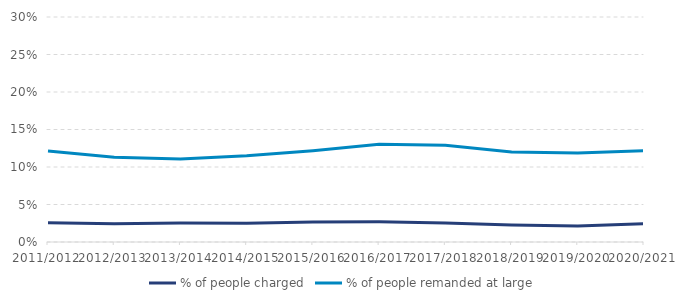
| Category | % of people charged | % of people remanded at large |
|---|---|---|
| 2011/2012 | 0.026 | 0.121 |
| 2012/2013 | 0.024 | 0.113 |
| 2013/2014 | 0.025 | 0.111 |
| 2014/2015 | 0.025 | 0.115 |
| 2015/2016 | 0.027 | 0.122 |
| 2016/2017 | 0.027 | 0.13 |
| 2017/2018 | 0.025 | 0.129 |
| 2018/2019 | 0.023 | 0.12 |
| 2019/2020 | 0.021 | 0.119 |
| 2020/2021 | 0.024 | 0.122 |